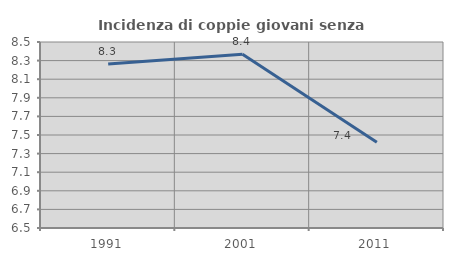
| Category | Incidenza di coppie giovani senza figli |
|---|---|
| 1991.0 | 8.264 |
| 2001.0 | 8.369 |
| 2011.0 | 7.421 |